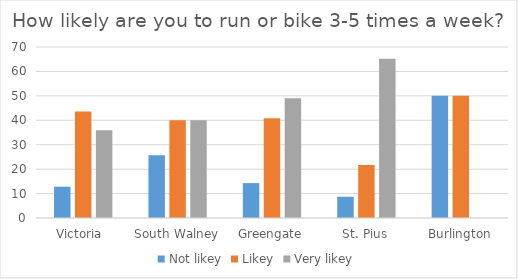
| Category | Not likey | Likey | Very likey |
|---|---|---|---|
| Victoria  | 12.821 | 43.59 | 35.897 |
| South Walney | 25.714 | 40 | 40 |
| Greengate | 14.286 | 40.816 | 48.98 |
| St. Pius | 8.696 | 21.739 | 65.217 |
| Burlington | 50 | 50 | 0 |